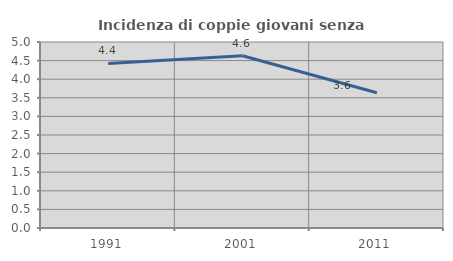
| Category | Incidenza di coppie giovani senza figli |
|---|---|
| 1991.0 | 4.425 |
| 2001.0 | 4.63 |
| 2011.0 | 3.636 |